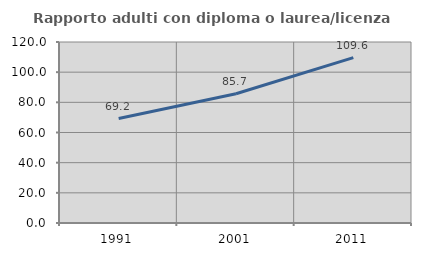
| Category | Rapporto adulti con diploma o laurea/licenza media  |
|---|---|
| 1991.0 | 69.231 |
| 2001.0 | 85.714 |
| 2011.0 | 109.639 |